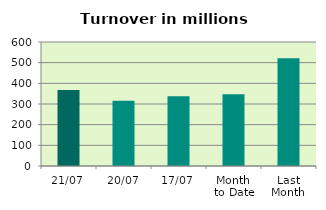
| Category | Series 0 |
|---|---|
| 21/07 | 368.153 |
| 20/07 | 315.539 |
| 17/07 | 336.935 |
| Month 
to Date | 347.117 |
| Last
Month | 521.023 |